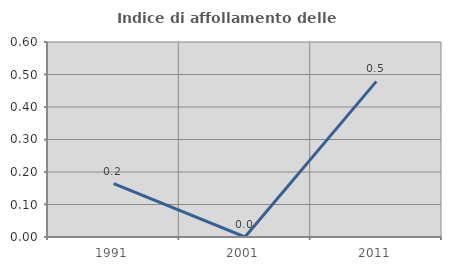
| Category | Indice di affollamento delle abitazioni  |
|---|---|
| 1991.0 | 0.164 |
| 2001.0 | 0 |
| 2011.0 | 0.479 |